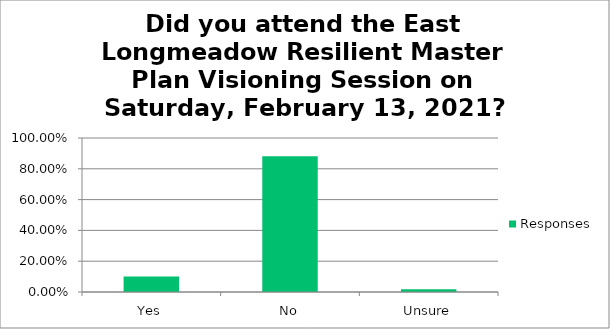
| Category | Responses |
|---|---|
| Yes | 0.1 |
| No | 0.881 |
| Unsure | 0.018 |